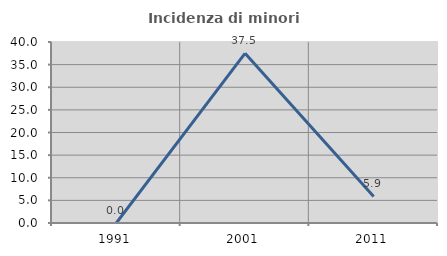
| Category | Incidenza di minori stranieri |
|---|---|
| 1991.0 | 0 |
| 2001.0 | 37.5 |
| 2011.0 | 5.882 |